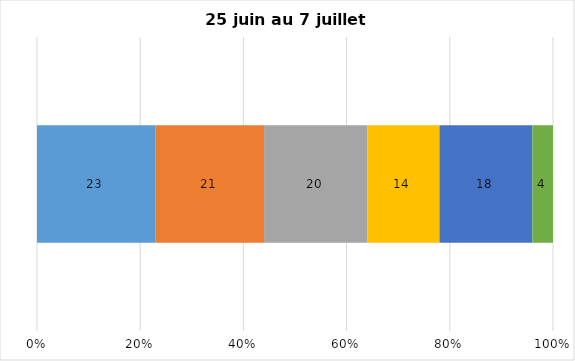
| Category | Plusieurs fois par jour | Une fois par jour | Quelques fois par semaine   | Une fois par semaine ou moins   |  Jamais   |  Je n’utilise pas les médias sociaux |
|---|---|---|---|---|---|---|
| 0 | 23 | 21 | 20 | 14 | 18 | 4 |